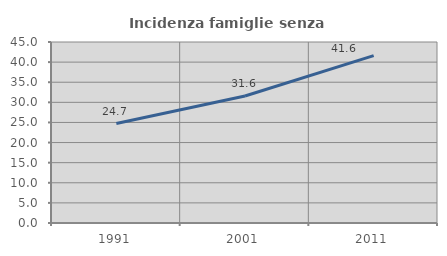
| Category | Incidenza famiglie senza nuclei |
|---|---|
| 1991.0 | 24.719 |
| 2001.0 | 31.579 |
| 2011.0 | 41.615 |